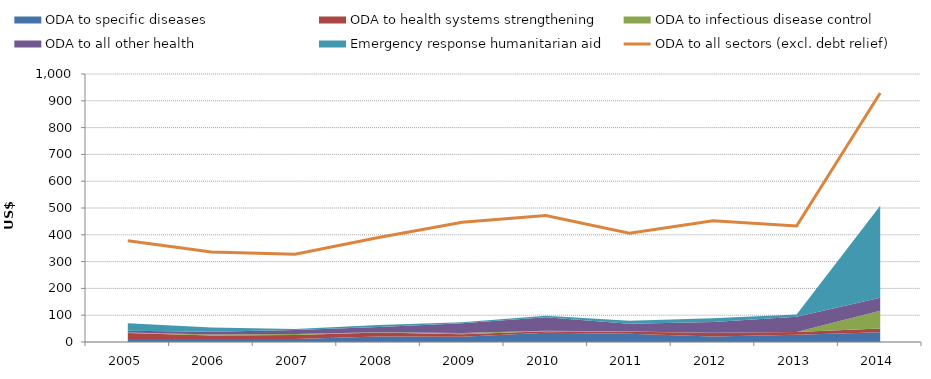
| Category | ODA to all sectors (excl. debt relief) |
|---|---|
| 2005.0 | 377.696 |
| 2006.0 | 335.794 |
| 2007.0 | 327.355 |
| 2008.0 | 390.127 |
| 2009.0 | 446.459 |
| 2010.0 | 471.683 |
| 2011.0 | 406.126 |
| 2012.0 | 452.608 |
| 2013.0 | 432.714 |
| 2014.0 | 929.328 |